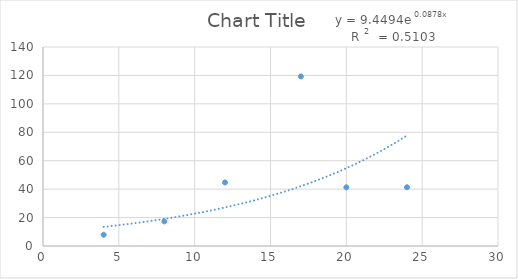
| Category | Series 0 |
|---|---|
| 4.0 | 7.9 |
| 8.0 | 17.3 |
| 12.0 | 44.7 |
| 17.0 | 119.3 |
| 20.0 | 41.3 |
| 24.0 | 41.3 |